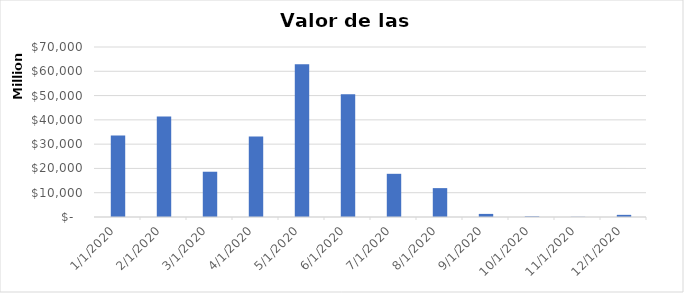
| Category | Valor Importaciones (COP) |
|---|---|
| 1/1/20 | 33524756159.33 |
| 2/1/20 | 41351314258.08 |
| 3/1/20 | 18640576561.29 |
| 4/1/20 | 33130249937.85 |
| 5/1/20 | 62892874046.22 |
| 6/1/20 | 50588602541.54 |
| 7/1/20 | 17785965878.71 |
| 8/1/20 | 11890648911.95 |
| 9/1/20 | 1277006231.83 |
| 10/1/20 | 258683211.89 |
| 11/1/20 | 80691628.59 |
| 12/1/20 | 883494550.44 |